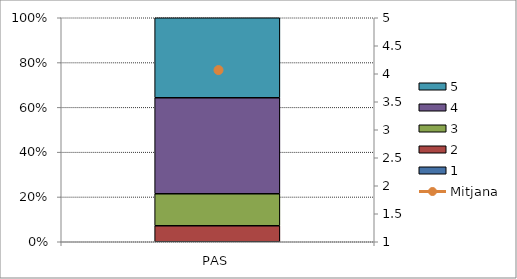
| Category | 1 | 2 | 3 | 4 | 5 |
|---|---|---|---|---|---|
| PAS | 0 | 1 | 2 | 6 | 5 |